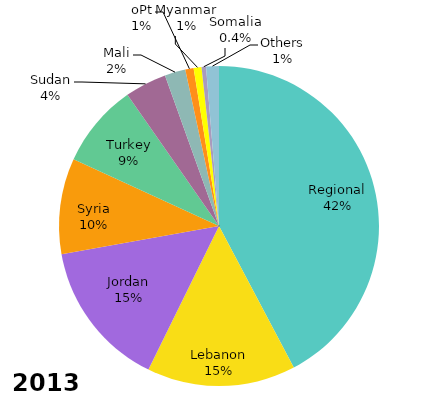
| Category | US$ millions |
|---|---|
| Regional | 100.062 |
| Lebanon | 35.544 |
| Jordan | 35.273 |
| Syria | 22.911 |
| Turkey | 20.019 |
| Sudan | 10 |
| Mali | 4.961 |
| oPt | 2 |
| Myanmar | 1.884 |
| Somalia | 1.071 |
| Others | 3.058 |